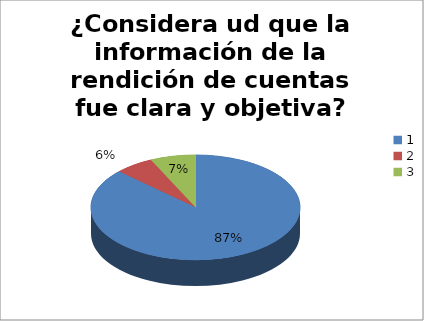
| Category | Series 0 |
|---|---|
| 0 | 87 |
| 1 | 6 |
| 2 | 7 |